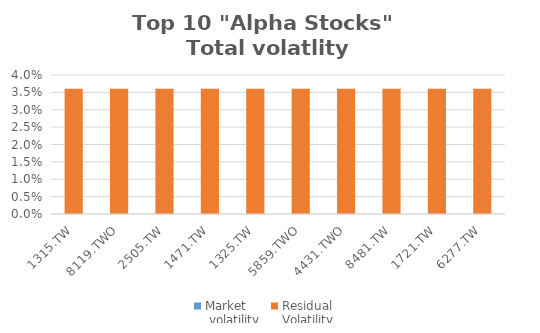
| Category | Market
 volatility | Residual
Volatility |
|---|---|---|
| 1315.TW | 0 | 0.036 |
| 8119.TWO | 0 | 0.036 |
| 2505.TW | 0 | 0.036 |
| 1471.TW | 0 | 0.036 |
| 1325.TW | 0 | 0.036 |
| 5859.TWO | 0 | 0.036 |
| 4431.TWO | 0 | 0.036 |
| 8481.TW | 0 | 0.036 |
| 1721.TW | 0 | 0.036 |
| 6277.TW | 0 | 0.036 |